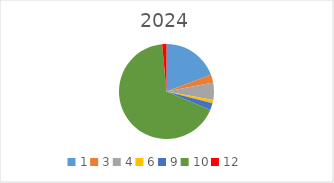
| Category | Series 0 |
|---|---|
| 1.0 | 66000 |
| 3.0 | 9250 |
| 4.0 | 20000 |
| 6.0 | 4000 |
| 9.0 | 8000 |
| 10.0 | 230000 |
| 12.0 | 5000 |